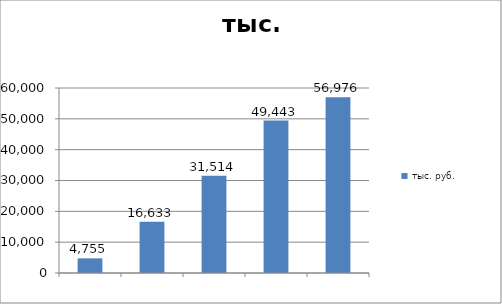
| Category | тыс. руб. |
|---|---|
|  | 4755 |
|  | 16633.026 |
|  | 31514.207 |
|  | 49442.872 |
|  | 56975.827 |